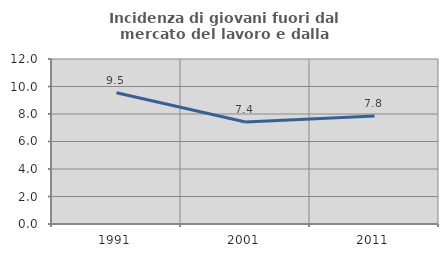
| Category | Incidenza di giovani fuori dal mercato del lavoro e dalla formazione  |
|---|---|
| 1991.0 | 9.548 |
| 2001.0 | 7.422 |
| 2011.0 | 7.849 |